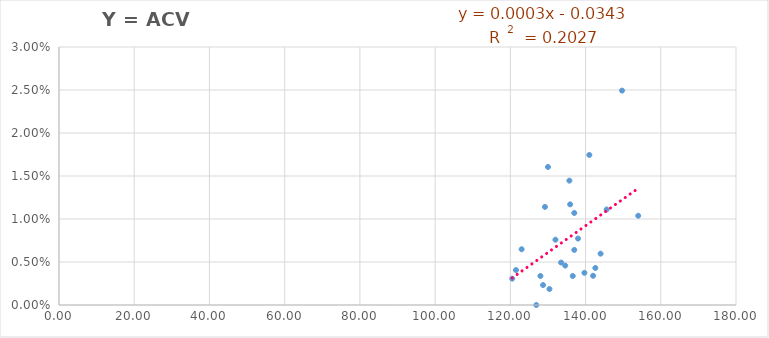
| Category | Y = ACV /año |
|---|---|
| 139.7 | 0.004 |
| 144.0 | 0.006 |
| 132.0 | 0.008 |
| 128.0 | 0.003 |
| 135.9 | 0.012 |
| 120.5 | 0.003 |
| 136.6 | 0.003 |
| 130.0 | 0.016 |
| 128.7 | 0.002 |
| 135.7 | 0.014 |
| 123.0 | 0.006 |
| 121.5 | 0.004 |
| 126.9 | 0 |
| 142.6 | 0.004 |
| 154.0 | 0.01 |
| 138.0 | 0.008 |
| 137.0 | 0.011 |
| 145.6 | 0.011 |
| 133.5 | 0.005 |
| 142.0 | 0.003 |
| 141.0 | 0.017 |
| 130.4 | 0.002 |
| 149.7 | 0.025 |
| 137.0 | 0.006 |
| 134.6 | 0.005 |
| 129.2 | 0.011 |